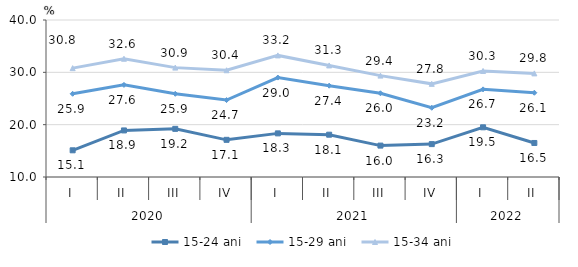
| Category | 15-24 ani | 15-29 ani | 15-34 ani |
|---|---|---|---|
| 0 | 15.1 | 25.9 | 30.8 |
| 1 | 18.9 | 27.6 | 32.6 |
| 2 | 19.2 | 25.9 | 30.9 |
| 3 | 17.1 | 24.7 | 30.4 |
| 4 | 18.335 | 28.999 | 33.235 |
| 5 | 18.083 | 27.448 | 31.318 |
| 6 | 16 | 26 | 29.373 |
| 7 | 16.283 | 23.232 | 27.8 |
| 8 | 19.497 | 26.744 | 30.262 |
| 9 | 16.5 | 26.1 | 29.8 |